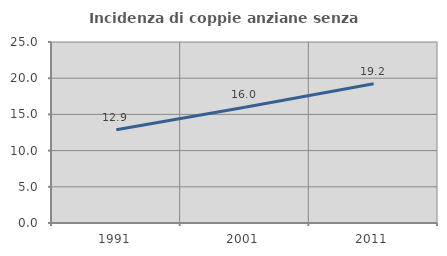
| Category | Incidenza di coppie anziane senza figli  |
|---|---|
| 1991.0 | 12.868 |
| 2001.0 | 15.984 |
| 2011.0 | 19.231 |